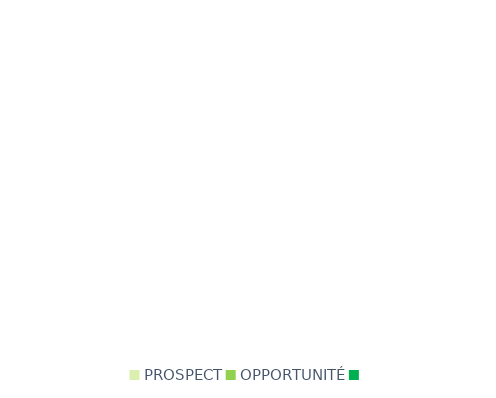
| Category | Series 0 |
|---|---|
| PROSPECT | 0 |
| OPPORTUNITÉ | 0 |